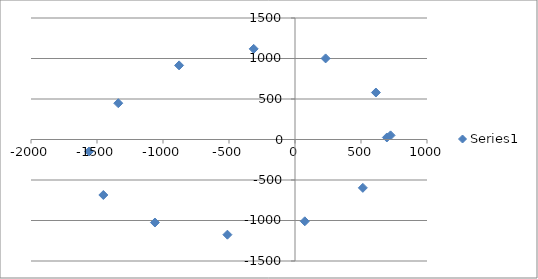
| Category | Series 0 |
|---|---|
| 696.0 | 25 |
| 514.0 | -597 |
| 74.0 | -1010 |
| -512.0 | -1175 |
| -1061.0 | -1025 |
| -1452.0 | -685 |
| -1560.0 | -148 |
| -1339.0 | 448 |
| -878.0 | 915 |
| -313.0 | 1119 |
| 232.0 | 1001 |
| 613.0 | 580 |
| 724.0 | 51 |